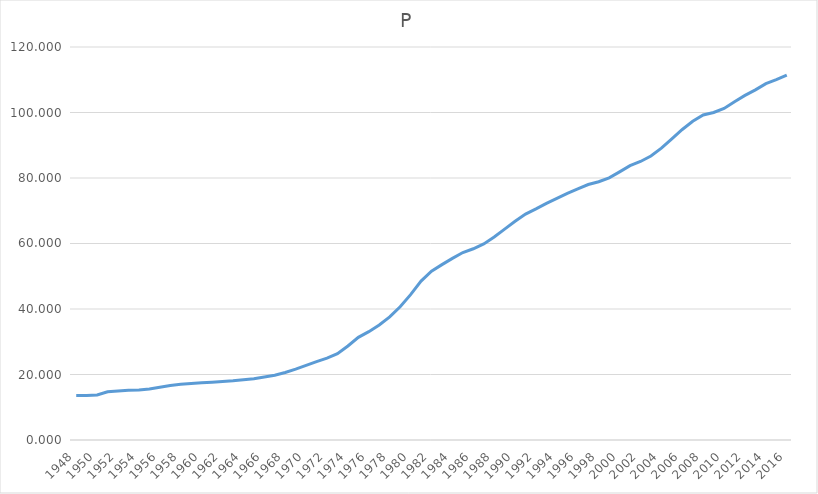
| Category | P |
|---|---|
| 1948.0 | 13.603 |
| 1949.0 | 13.581 |
| 1950.0 | 13.738 |
| 1951.0 | 14.715 |
| 1952.0 | 14.971 |
| 1953.0 | 15.157 |
| 1954.0 | 15.298 |
| 1955.0 | 15.558 |
| 1956.0 | 16.09 |
| 1957.0 | 16.625 |
| 1958.0 | 17 |
| 1959.0 | 17.237 |
| 1960.0 | 17.477 |
| 1961.0 | 17.668 |
| 1962.0 | 17.886 |
| 1963.0 | 18.087 |
| 1964.0 | 18.365 |
| 1965.0 | 18.7 |
| 1966.0 | 19.226 |
| 1967.0 | 19.785 |
| 1968.0 | 20.625 |
| 1969.0 | 21.642 |
| 1970.0 | 22.785 |
| 1971.0 | 23.94 |
| 1972.0 | 24.973 |
| 1973.0 | 26.335 |
| 1974.0 | 28.708 |
| 1975.0 | 31.353 |
| 1976.0 | 33.079 |
| 1977.0 | 35.127 |
| 1978.0 | 37.585 |
| 1979.0 | 40.702 |
| 1980.0 | 44.378 |
| 1981.0 | 48.522 |
| 1982.0 | 51.53 |
| 1983.0 | 53.554 |
| 1984.0 | 55.459 |
| 1985.0 | 57.236 |
| 1986.0 | 58.393 |
| 1987.0 | 59.879 |
| 1988.0 | 61.974 |
| 1989.0 | 64.388 |
| 1990.0 | 66.774 |
| 1991.0 | 68.993 |
| 1992.0 | 70.564 |
| 1993.0 | 72.244 |
| 1994.0 | 73.781 |
| 1995.0 | 75.321 |
| 1996.0 | 76.695 |
| 1997.0 | 78.009 |
| 1998.0 | 78.855 |
| 1999.0 | 80.061 |
| 2000.0 | 81.883 |
| 2001.0 | 83.753 |
| 2002.0 | 85.038 |
| 2003.0 | 86.729 |
| 2004.0 | 89.114 |
| 2005.0 | 91.981 |
| 2006.0 | 94.812 |
| 2007.0 | 97.334 |
| 2008.0 | 99.25 |
| 2009.0 | 100 |
| 2010.0 | 101.217 |
| 2011.0 | 103.307 |
| 2012.0 | 105.213 |
| 2013.0 | 106.91 |
| 2014.0 | 108.827 |
| 2015.0 | 110.01 |
| 2016.0 | 111.412 |